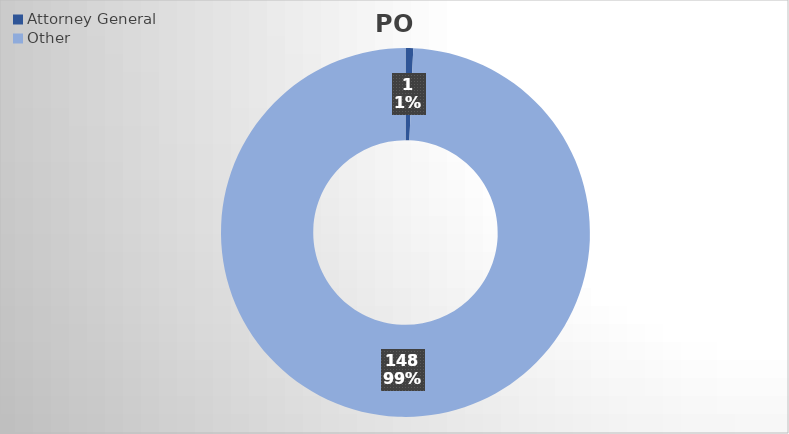
| Category | PO Lines |
|---|---|
| Attorney General | 1 |
| Other | 148 |